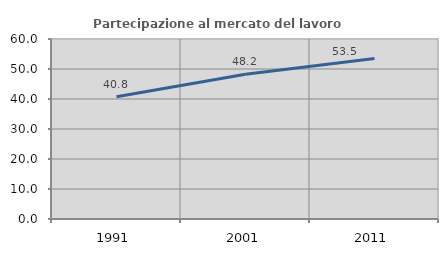
| Category | Partecipazione al mercato del lavoro  femminile |
|---|---|
| 1991.0 | 40.756 |
| 2001.0 | 48.22 |
| 2011.0 | 53.477 |